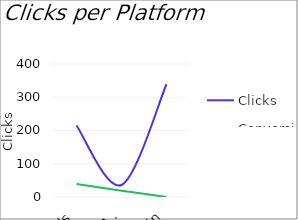
| Category | Clicks | Conversion |
|---|---|---|
| Google Ads | 215 | 39 |
| Facebook Ads | 36 | 19 |
| Linkedin | 339 | 0 |